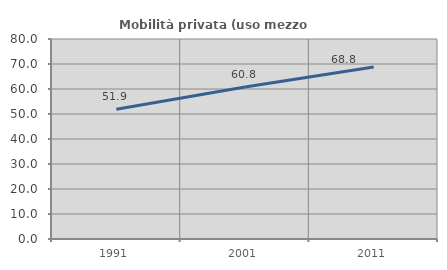
| Category | Mobilità privata (uso mezzo privato) |
|---|---|
| 1991.0 | 51.9 |
| 2001.0 | 60.832 |
| 2011.0 | 68.816 |